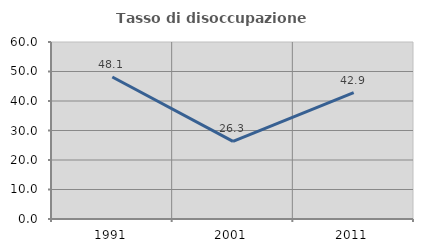
| Category | Tasso di disoccupazione giovanile  |
|---|---|
| 1991.0 | 48.148 |
| 2001.0 | 26.316 |
| 2011.0 | 42.857 |